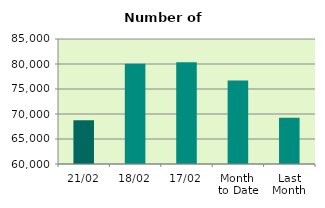
| Category | Series 0 |
|---|---|
| 21/02 | 68740 |
| 18/02 | 80062 |
| 17/02 | 80326 |
| Month 
to Date | 76683.067 |
| Last
Month | 69227.8 |